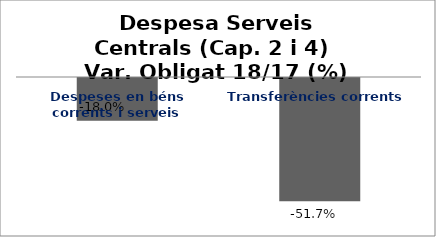
| Category | Series 0 |
|---|---|
| Despeses en béns corrents i serveis | -0.18 |
| Transferències corrents | -0.517 |